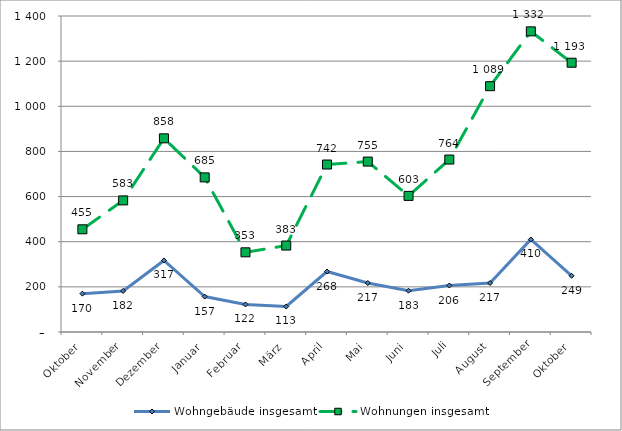
| Category | Wohngebäude insgesamt | Wohnungen insgesamt |
|---|---|---|
| Oktober | 170 | 455 |
| November | 182 | 583 |
| Dezember | 317 | 858 |
| Januar | 157 | 685 |
| Februar | 122 | 353 |
| März | 113 | 383 |
| April | 268 | 742 |
| Mai | 217 | 755 |
| Juni | 183 | 603 |
| Juli | 206 | 764 |
| August | 217 | 1089 |
| September | 410 | 1332 |
| Oktober | 249 | 1193 |